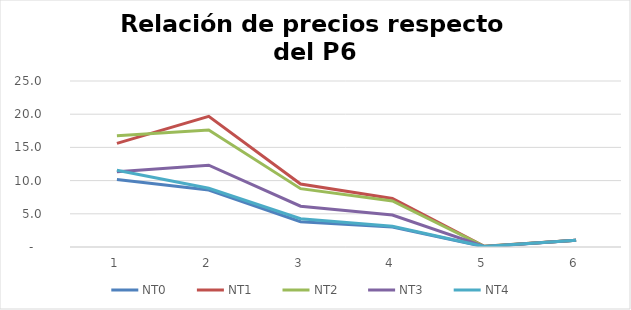
| Category | NT0 | NT1 | NT2 | NT3 | NT4 |
|---|---|---|---|---|---|
| 0 | 10.158 | 15.613 | 16.765 | 11.336 | 11.555 |
| 1 | 8.585 | 19.685 | 17.631 | 12.326 | 8.843 |
| 2 | 3.806 | 9.49 | 8.784 | 6.141 | 4.254 |
| 3 | 2.999 | 7.312 | 6.927 | 4.807 | 3.131 |
| 4 | 0.046 | 0.107 | 0.11 | 0.083 | 0.075 |
| 5 | 1 | 1 | 1 | 1 | 1 |